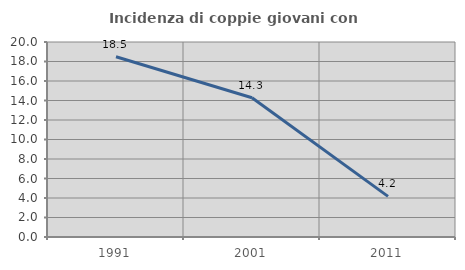
| Category | Incidenza di coppie giovani con figli |
|---|---|
| 1991.0 | 18.487 |
| 2001.0 | 14.286 |
| 2011.0 | 4.167 |